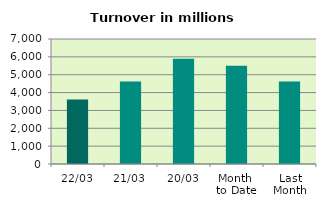
| Category | Series 0 |
|---|---|
| 22/03 | 3615.765 |
| 21/03 | 4620.011 |
| 20/03 | 5890.305 |
| Month 
to Date | 5495.656 |
| Last
Month | 4623.097 |